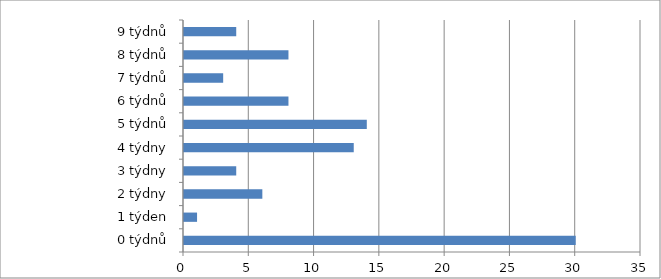
| Category | Series 0 |
|---|---|
| 0 týdnů | 30 |
| 1 týden | 1 |
| 2 týdny | 6 |
| 3 týdny | 4 |
| 4 týdny | 13 |
| 5 týdnů | 14 |
| 6 týdnů | 8 |
| 7 týdnů | 3 |
| 8 týdnů | 8 |
| 9 týdnů | 4 |